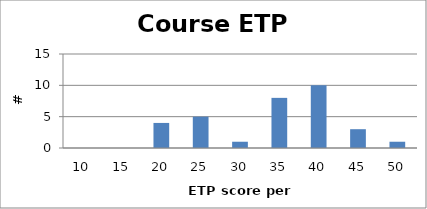
| Category | Series 0 |
|---|---|
| 10.0 | 0 |
| 15.0 | 0 |
| 20.0 | 4 |
| 25.0 | 5 |
| 30.0 | 1 |
| 35.0 | 8 |
| 40.0 | 10 |
| 45.0 | 3 |
| 50.0 | 1 |